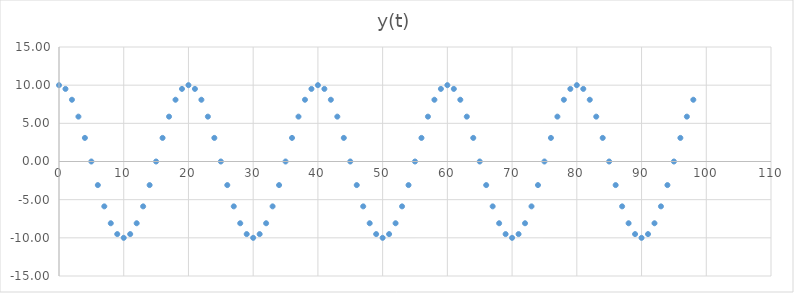
| Category | Series 0 |
|---|---|
| 0.0 | 10 |
| 1.0 | 9.511 |
| 2.0 | 8.09 |
| 3.0 | 5.878 |
| 4.0 | 3.09 |
| 5.0 | 0 |
| 6.0 | -3.09 |
| 7.0 | -5.878 |
| 8.0 | -8.09 |
| 9.0 | -9.511 |
| 10.0 | -10 |
| 11.0 | -9.511 |
| 12.0 | -8.09 |
| 13.0 | -5.878 |
| 14.0 | -3.09 |
| 15.0 | 0 |
| 16.0 | 3.09 |
| 17.0 | 5.878 |
| 18.0 | 8.09 |
| 19.0 | 9.511 |
| 20.0 | 10 |
| 21.0 | 9.511 |
| 22.0 | 8.09 |
| 23.0 | 5.878 |
| 24.0 | 3.09 |
| 25.0 | 0 |
| 26.0 | -3.09 |
| 27.0 | -5.878 |
| 28.0 | -8.09 |
| 29.0 | -9.511 |
| 30.0 | -10 |
| 31.0 | -9.511 |
| 32.0 | -8.09 |
| 33.0 | -5.878 |
| 34.0 | -3.09 |
| 35.0 | 0 |
| 36.0 | 3.09 |
| 37.0 | 5.878 |
| 38.0 | 8.09 |
| 39.0 | 9.511 |
| 40.0 | 10 |
| 41.0 | 9.511 |
| 42.0 | 8.09 |
| 43.0 | 5.878 |
| 44.0 | 3.09 |
| 45.0 | 0 |
| 46.0 | -3.09 |
| 47.0 | -5.878 |
| 48.0 | -8.09 |
| 49.0 | -9.511 |
| 50.0 | -10 |
| 51.0 | -9.511 |
| 52.0 | -8.09 |
| 53.0 | -5.878 |
| 54.0 | -3.09 |
| 55.0 | 0 |
| 56.0 | 3.09 |
| 57.0 | 5.878 |
| 58.0 | 8.09 |
| 59.0 | 9.511 |
| 60.0 | 10 |
| 61.0 | 9.511 |
| 62.0 | 8.09 |
| 63.0 | 5.878 |
| 64.0 | 3.09 |
| 65.0 | 0 |
| 66.0 | -3.09 |
| 67.0 | -5.878 |
| 68.0 | -8.09 |
| 69.0 | -9.511 |
| 70.0 | -10 |
| 71.0 | -9.511 |
| 72.0 | -8.09 |
| 73.0 | -5.878 |
| 74.0 | -3.09 |
| 75.0 | 0 |
| 76.0 | 3.09 |
| 77.0 | 5.878 |
| 78.0 | 8.09 |
| 79.0 | 9.511 |
| 80.0 | 10 |
| 81.0 | 9.511 |
| 82.0 | 8.09 |
| 83.0 | 5.878 |
| 84.0 | 3.09 |
| 85.0 | 0 |
| 86.0 | -3.09 |
| 87.0 | -5.878 |
| 88.0 | -8.09 |
| 89.0 | -9.511 |
| 90.0 | -10 |
| 91.0 | -9.511 |
| 92.0 | -8.09 |
| 93.0 | -5.878 |
| 94.0 | -3.09 |
| 95.0 | 0 |
| 96.0 | 3.09 |
| 97.0 | 5.878 |
| 98.0 | 8.09 |